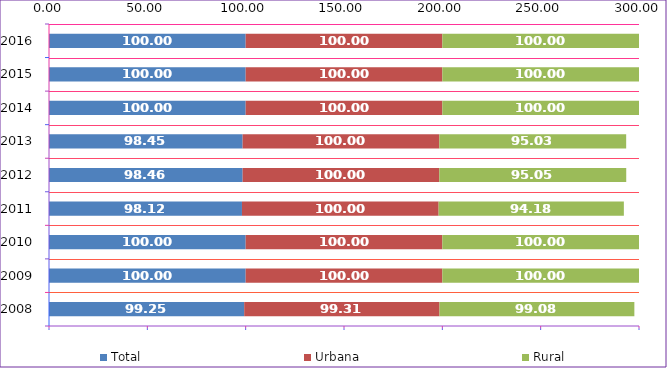
| Category | Total | Urbana | Rural |
|---|---|---|---|
| 2008.0 | 99.25 | 99.31 | 99.08 |
| 2009.0 | 100 | 100 | 100 |
| 2010.0 | 100 | 100 | 100 |
| 2011.0 | 98.12 | 100 | 94.18 |
| 2012.0 | 98.46 | 100 | 95.05 |
| 2013.0 | 98.45 | 100 | 95.03 |
| 2014.0 | 100 | 100 | 100 |
| 2015.0 | 100 | 100 | 100 |
| 2016.0 | 100 | 100 | 100 |